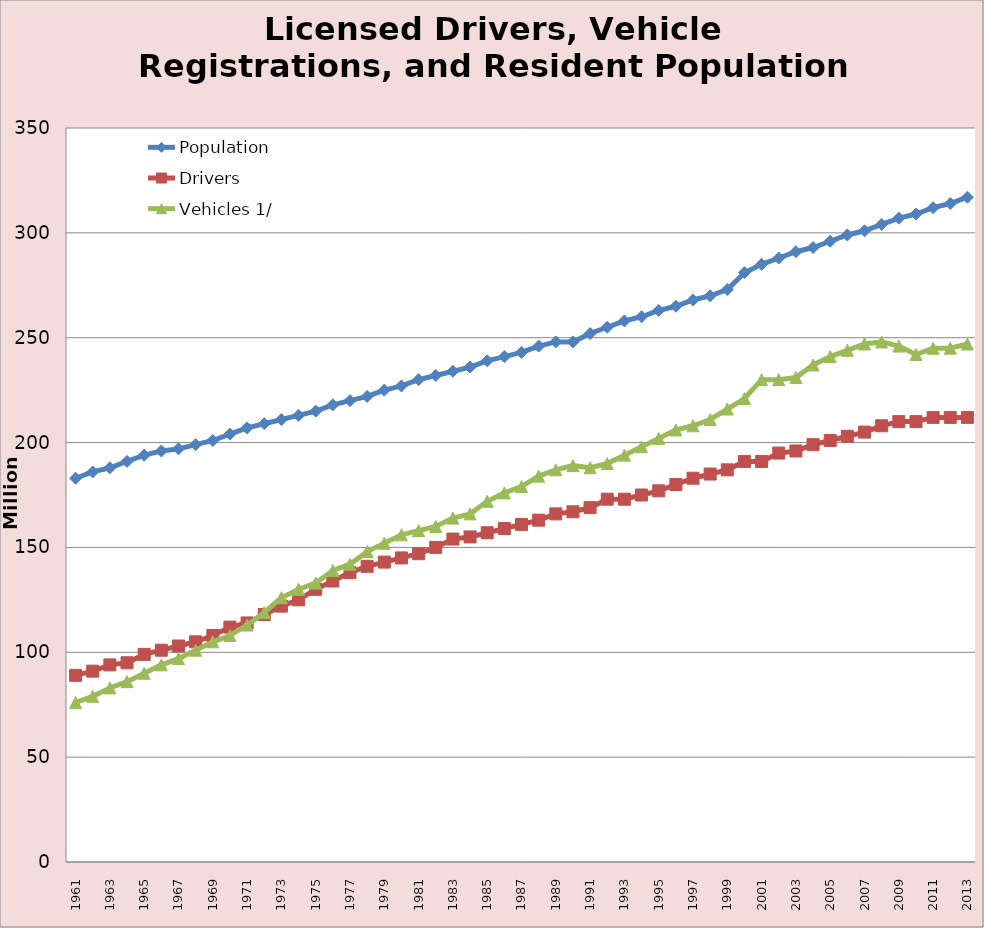
| Category | Population | Drivers  | Vehicles 1/ |
|---|---|---|---|
| 1961 | 183 | 89 | 76 |
| 1962 | 186 | 91 | 79 |
| 1963 | 188 | 94 | 83 |
| 1964 | 191 | 95 | 86 |
| 1965 | 194 | 99 | 90 |
| 1966 | 196 | 101 | 94 |
| 1967 | 197 | 103 | 97 |
| 1968 | 199 | 105 | 101 |
| 1969 | 201 | 108 | 105 |
| 1970 | 204 | 112 | 108 |
| 1971 | 207 | 114 | 113 |
| 1972 | 209 | 118 | 119 |
| 1973 | 211 | 122 | 126 |
| 1974 | 213 | 125 | 130 |
| 1975 | 215 | 130 | 133 |
| 1976 | 218 | 134 | 139 |
| 1977 | 220 | 138 | 142 |
| 1978 | 222 | 141 | 148 |
| 1979 | 225 | 143 | 152 |
| 1980 | 227 | 145 | 156 |
| 1981 | 230 | 147 | 158 |
| 1982 | 232 | 150 | 160 |
| 1983 | 234 | 154 | 164 |
| 1984 | 236 | 155 | 166 |
| 1985 | 239 | 157 | 172 |
| 1986 | 241 | 159 | 176 |
| 1987 | 243 | 161 | 179 |
| 1988 | 246 | 163 | 184 |
| 1989 | 248 | 166 | 187 |
| 1990 | 248 | 167 | 189 |
| 1991 | 252 | 169 | 188 |
| 1992 | 255 | 173 | 190 |
| 1993 | 258 | 173 | 194 |
| 1994 | 260 | 175 | 198 |
| 1995 | 263 | 177 | 202 |
| 1996 | 265 | 180 | 206 |
| 1997 | 268 | 183 | 208 |
| 1998 | 270 | 185 | 211 |
| 1999 | 273 | 187 | 216 |
| 2000 | 281 | 191 | 221 |
| 2001 | 285 | 191 | 230 |
| 2002 | 288 | 195 | 230 |
| 2003 | 291 | 196 | 231 |
| 2004 | 293 | 199 | 237 |
| 2005 | 296 | 201 | 241 |
| 2006 | 299 | 203 | 244 |
| 2007 | 301 | 205 | 247 |
| 2008 | 304 | 208 | 248 |
| 2009 | 307 | 210 | 246 |
| 2010 | 309 | 210 | 242 |
| 2011 | 312 | 212 | 245 |
| 2012 | 314 | 212 | 245 |
| 2013 | 317 | 212 | 247 |